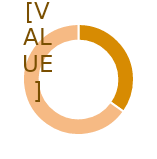
| Category | Series 0 |
|---|---|
| 0 | 0.349 |
| 1 | 0.651 |